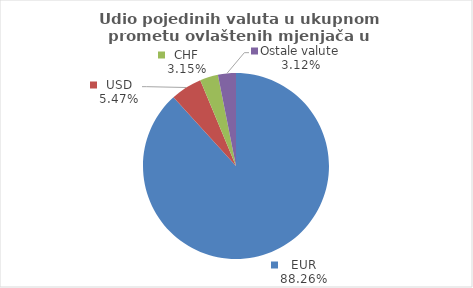
| Category | Series 0 |
|---|---|
| EUR | 88.261 |
| USD | 5.464 |
| CHF | 3.152 |
| Ostale valute | 3.124 |